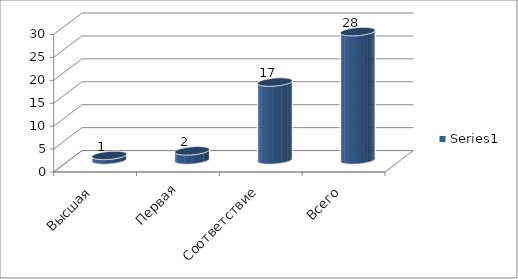
| Category | Series 0 |
|---|---|
| Высшая | 1 |
| Первая | 2 |
| Соответствие | 17 |
| Всего | 28 |